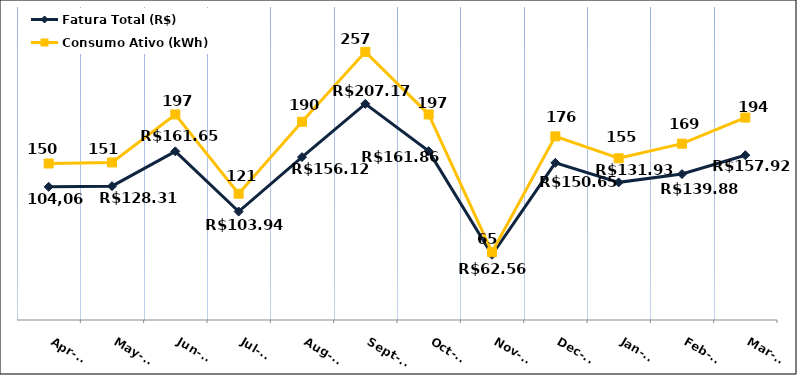
| Category | Fatura Total (R$) | Consumo Ativo (kWh) |
|---|---|---|
| 2023-04-01 | 127.65 | 150 |
| 2023-05-01 | 128.31 | 151 |
| 2023-06-01 | 161.65 | 197 |
| 2023-07-01 | 103.94 | 121 |
| 2023-08-01 | 156.12 | 190 |
| 2023-09-01 | 207.17 | 257 |
| 2023-10-01 | 161.86 | 197 |
| 2023-11-01 | 62.56 | 65 |
| 2023-12-01 | 150.65 | 176 |
| 2024-01-01 | 131.93 | 155 |
| 2024-02-01 | 139.88 | 169 |
| 2024-03-01 | 157.92 | 194 |